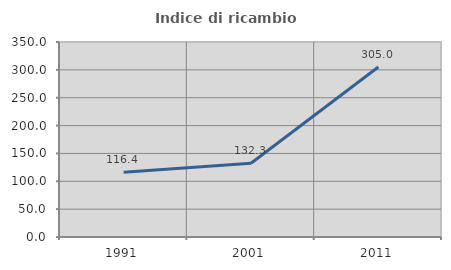
| Category | Indice di ricambio occupazionale  |
|---|---|
| 1991.0 | 116.4 |
| 2001.0 | 132.258 |
| 2011.0 | 305 |